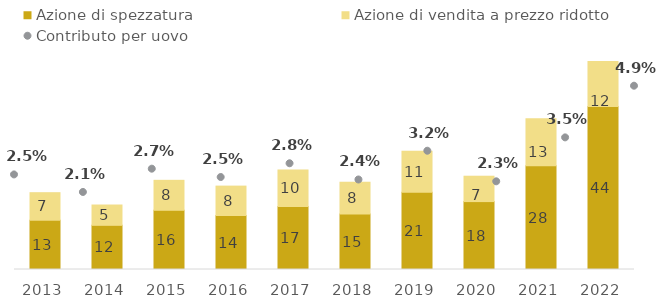
| Category | Azione di spezzatura | Azione di vendita a prezzo ridotto |
|---|---|---|
| 2013.0 | 13.195 | 7.377 |
| 2014.0 | 11.831 | 5.443 |
| 2015.0 | 15.862 | 8.023 |
| 2016.0 | 14.46 | 7.877 |
| 2017.0 | 16.875 | 9.754 |
| 2018.0 | 14.887 | 8.455 |
| 2019.0 | 20.71 | 10.983 |
| 2020.0 | 18.19 | 6.795 |
| 2021.0 | 27.802 | 12.578 |
| 2022.0 | 43.676 | 12.039 |